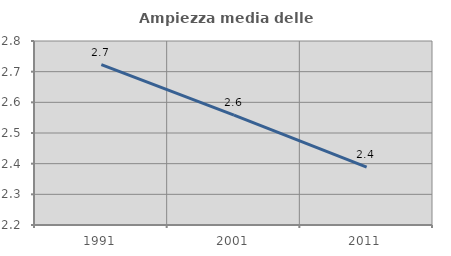
| Category | Ampiezza media delle famiglie |
|---|---|
| 1991.0 | 2.723 |
| 2001.0 | 2.559 |
| 2011.0 | 2.389 |